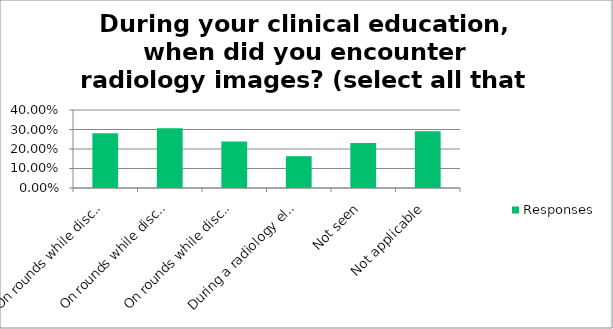
| Category | Responses |
|---|---|
| On rounds while discussing with radiologist | 0.281 |
| On rounds while discussing with non-radiologist doctor | 0.307 |
| On rounds while discussing with training doctor | 0.239 |
| During a radiology elective | 0.163 |
| Not seen | 0.231 |
| Not applicable | 0.29 |